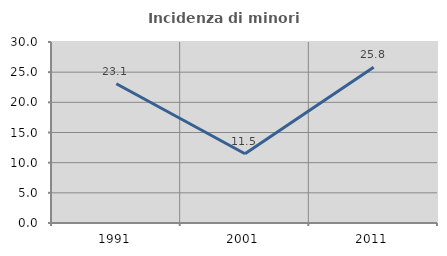
| Category | Incidenza di minori stranieri |
|---|---|
| 1991.0 | 23.077 |
| 2001.0 | 11.475 |
| 2011.0 | 25.818 |